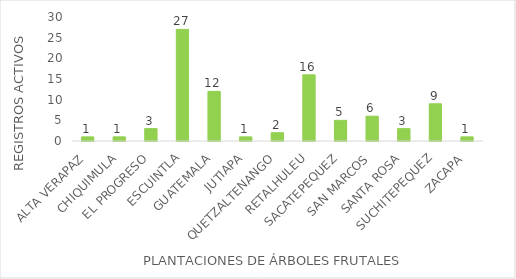
| Category | Series 0 |
|---|---|
| ALTA VERAPAZ | 1 |
| CHIQUIMULA | 1 |
| EL PROGRESO | 3 |
| ESCUINTLA | 27 |
| GUATEMALA | 12 |
| JUTIAPA | 1 |
| QUETZALTENANGO | 2 |
| RETALHULEU | 16 |
| SACATEPEQUEZ | 5 |
| SAN MARCOS | 6 |
| SANTA ROSA | 3 |
| SUCHITEPEQUEZ | 9 |
| ZACAPA | 1 |